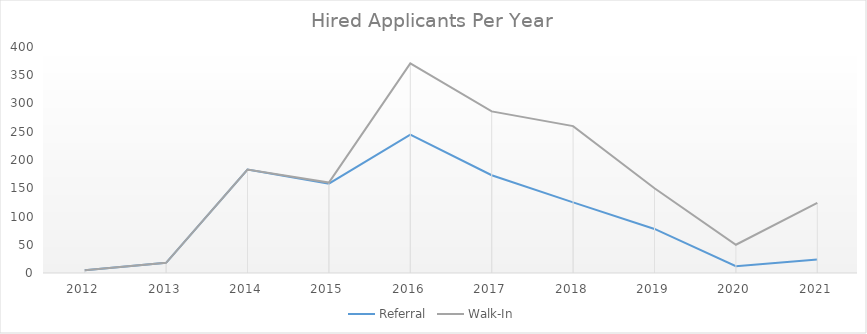
| Category | Referral | Walk-In |
|---|---|---|
| 2012 | 5 | 0 |
| 2013 | 18 | 0 |
| 2014 | 183 | 0 |
| 2015 | 158 | 2 |
| 2016 | 245 | 126 |
| 2017 | 173 | 113 |
| 2018 | 125 | 135 |
| 2019 | 78 | 72 |
| 2020 | 12 | 38 |
| 2021 | 24 | 100 |